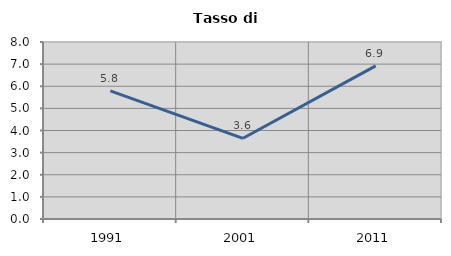
| Category | Tasso di disoccupazione   |
|---|---|
| 1991.0 | 5.788 |
| 2001.0 | 3.648 |
| 2011.0 | 6.919 |